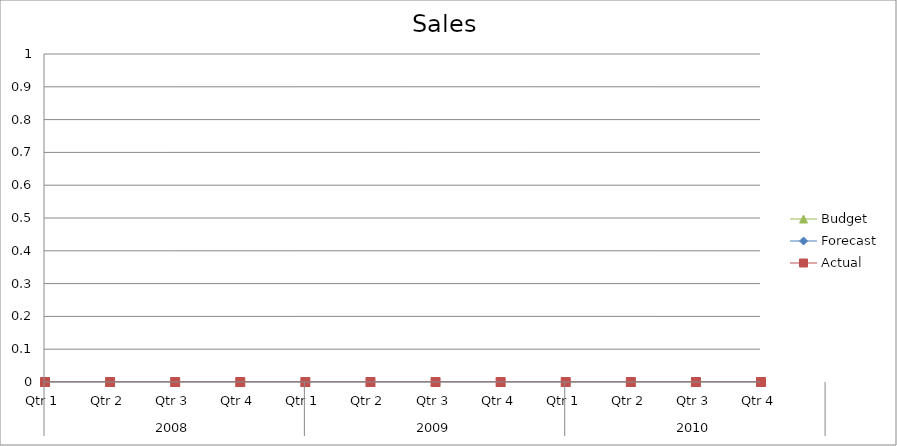
| Category | Budget | Forecast | Actual |
|---|---|---|---|
| 0 | 790 | 950 | 3140 |
| 1 | 820 | 1850 | 650 |
| 2 | 3100 | 1170 | 3210 |
| 3 | 2210 | 900 | 2300 |
| 4 | 3420 | 1250 | 3350 |
| 5 | 2560 | 510 | 2230 |
| 6 | 3020 | 2500 | 1500 |
| 7 | 2360 | 900 | 950 |
| 8 | 530 | 1290 | 3050 |
| 9 | 2440 | 1100 | 750 |
| 10 | 1100 | 3400 | 2170 |
| 11 | 600 | 3220 | 3000 |